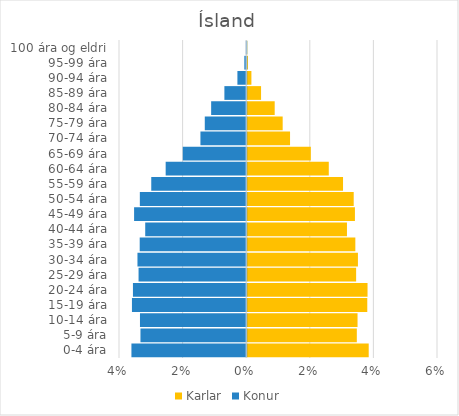
| Category | Karlar | Konur |
|---|---|---|
| 0-4 ára | 0.038 | -0.036 |
| 5-9 ára | 0.034 | -0.033 |
| 10-14 ára | 0.035 | -0.033 |
| 15-19 ára | 0.038 | -0.036 |
| 20-24 ára | 0.038 | -0.036 |
| 25-29 ára | 0.034 | -0.034 |
| 30-34 ára | 0.035 | -0.034 |
| 35-39 ára | 0.034 | -0.033 |
| 40-44 ára | 0.031 | -0.032 |
| 45-49 ára | 0.034 | -0.035 |
| 50-54 ára | 0.033 | -0.033 |
| 55-59 ára | 0.03 | -0.03 |
| 60-64 ára | 0.026 | -0.025 |
| 65-69 ára | 0.02 | -0.02 |
| 70-74 ára | 0.013 | -0.014 |
| 75-79 ára | 0.011 | -0.013 |
| 80-84 ára | 0.009 | -0.011 |
| 85-89 ára | 0.004 | -0.007 |
| 90-94 ára | 0.001 | -0.003 |
| 95-99 ára | 0 | -0.001 |
| 100 ára og eldri | 0 | 0 |